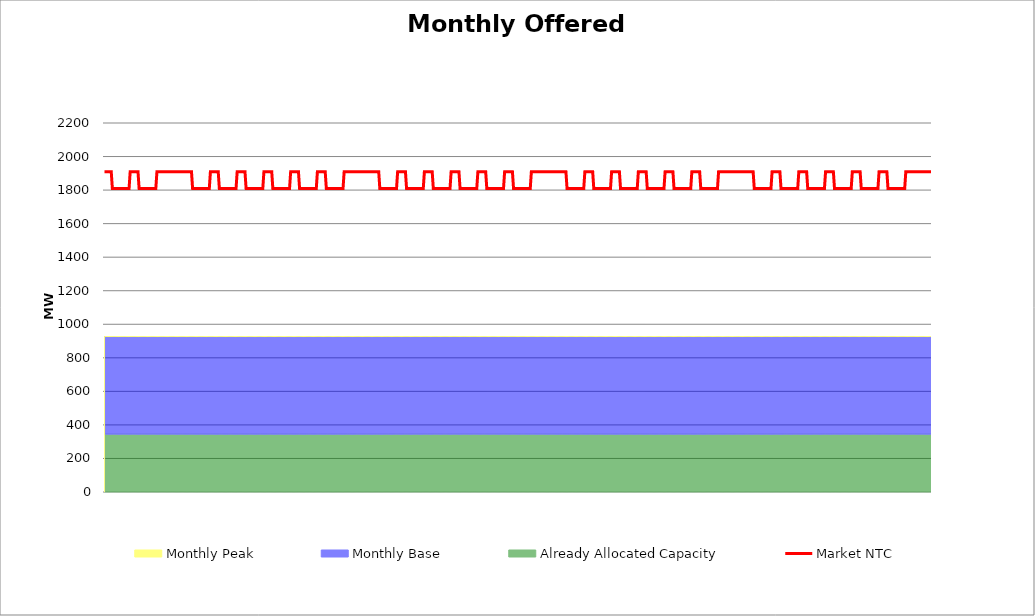
| Category | Market NTC |
|---|---|
| 0 | 1910 |
| 1 | 1910 |
| 2 | 1910 |
| 3 | 1910 |
| 4 | 1910 |
| 5 | 1910 |
| 6 | 1910 |
| 7 | 1810 |
| 8 | 1810 |
| 9 | 1810 |
| 10 | 1810 |
| 11 | 1810 |
| 12 | 1810 |
| 13 | 1810 |
| 14 | 1810 |
| 15 | 1810 |
| 16 | 1810 |
| 17 | 1810 |
| 18 | 1810 |
| 19 | 1810 |
| 20 | 1810 |
| 21 | 1810 |
| 22 | 1810 |
| 23 | 1910 |
| 24 | 1910 |
| 25 | 1910 |
| 26 | 1910 |
| 27 | 1910 |
| 28 | 1910 |
| 29 | 1910 |
| 30 | 1910 |
| 31 | 1810 |
| 32 | 1810 |
| 33 | 1810 |
| 34 | 1810 |
| 35 | 1810 |
| 36 | 1810 |
| 37 | 1810 |
| 38 | 1810 |
| 39 | 1810 |
| 40 | 1810 |
| 41 | 1810 |
| 42 | 1810 |
| 43 | 1810 |
| 44 | 1810 |
| 45 | 1810 |
| 46 | 1810 |
| 47 | 1910 |
| 48 | 1910 |
| 49 | 1910 |
| 50 | 1910 |
| 51 | 1910 |
| 52 | 1910 |
| 53 | 1910 |
| 54 | 1910 |
| 55 | 1910 |
| 56 | 1910 |
| 57 | 1910 |
| 58 | 1910 |
| 59 | 1910 |
| 60 | 1910 |
| 61 | 1910 |
| 62 | 1910 |
| 63 | 1910 |
| 64 | 1910 |
| 65 | 1910 |
| 66 | 1910 |
| 67 | 1910 |
| 68 | 1910 |
| 69 | 1910 |
| 70 | 1910 |
| 71 | 1910 |
| 72 | 1910 |
| 73 | 1910 |
| 74 | 1910 |
| 75 | 1910 |
| 76 | 1910 |
| 77 | 1910 |
| 78 | 1910 |
| 79 | 1810 |
| 80 | 1810 |
| 81 | 1810 |
| 82 | 1810 |
| 83 | 1810 |
| 84 | 1810 |
| 85 | 1810 |
| 86 | 1810 |
| 87 | 1810 |
| 88 | 1810 |
| 89 | 1810 |
| 90 | 1810 |
| 91 | 1810 |
| 92 | 1810 |
| 93 | 1810 |
| 94 | 1810 |
| 95 | 1910 |
| 96 | 1910 |
| 97 | 1910 |
| 98 | 1910 |
| 99 | 1910 |
| 100 | 1910 |
| 101 | 1910 |
| 102 | 1910 |
| 103 | 1810 |
| 104 | 1810 |
| 105 | 1810 |
| 106 | 1810 |
| 107 | 1810 |
| 108 | 1810 |
| 109 | 1810 |
| 110 | 1810 |
| 111 | 1810 |
| 112 | 1810 |
| 113 | 1810 |
| 114 | 1810 |
| 115 | 1810 |
| 116 | 1810 |
| 117 | 1810 |
| 118 | 1810 |
| 119 | 1910 |
| 120 | 1910 |
| 121 | 1910 |
| 122 | 1910 |
| 123 | 1910 |
| 124 | 1910 |
| 125 | 1910 |
| 126 | 1910 |
| 127 | 1810 |
| 128 | 1810 |
| 129 | 1810 |
| 130 | 1810 |
| 131 | 1810 |
| 132 | 1810 |
| 133 | 1810 |
| 134 | 1810 |
| 135 | 1810 |
| 136 | 1810 |
| 137 | 1810 |
| 138 | 1810 |
| 139 | 1810 |
| 140 | 1810 |
| 141 | 1810 |
| 142 | 1810 |
| 143 | 1910 |
| 144 | 1910 |
| 145 | 1910 |
| 146 | 1910 |
| 147 | 1910 |
| 148 | 1910 |
| 149 | 1910 |
| 150 | 1910 |
| 151 | 1810 |
| 152 | 1810 |
| 153 | 1810 |
| 154 | 1810 |
| 155 | 1810 |
| 156 | 1810 |
| 157 | 1810 |
| 158 | 1810 |
| 159 | 1810 |
| 160 | 1810 |
| 161 | 1810 |
| 162 | 1810 |
| 163 | 1810 |
| 164 | 1810 |
| 165 | 1810 |
| 166 | 1810 |
| 167 | 1910 |
| 168 | 1910 |
| 169 | 1910 |
| 170 | 1910 |
| 171 | 1910 |
| 172 | 1910 |
| 173 | 1910 |
| 174 | 1910 |
| 175 | 1810 |
| 176 | 1810 |
| 177 | 1810 |
| 178 | 1810 |
| 179 | 1810 |
| 180 | 1810 |
| 181 | 1810 |
| 182 | 1810 |
| 183 | 1810 |
| 184 | 1810 |
| 185 | 1810 |
| 186 | 1810 |
| 187 | 1810 |
| 188 | 1810 |
| 189 | 1810 |
| 190 | 1810 |
| 191 | 1910 |
| 192 | 1910 |
| 193 | 1910 |
| 194 | 1910 |
| 195 | 1910 |
| 196 | 1910 |
| 197 | 1910 |
| 198 | 1910 |
| 199 | 1810 |
| 200 | 1810 |
| 201 | 1810 |
| 202 | 1810 |
| 203 | 1810 |
| 204 | 1810 |
| 205 | 1810 |
| 206 | 1810 |
| 207 | 1810 |
| 208 | 1810 |
| 209 | 1810 |
| 210 | 1810 |
| 211 | 1810 |
| 212 | 1810 |
| 213 | 1810 |
| 214 | 1810 |
| 215 | 1910 |
| 216 | 1910 |
| 217 | 1910 |
| 218 | 1910 |
| 219 | 1910 |
| 220 | 1910 |
| 221 | 1910 |
| 222 | 1910 |
| 223 | 1910 |
| 224 | 1910 |
| 225 | 1910 |
| 226 | 1910 |
| 227 | 1910 |
| 228 | 1910 |
| 229 | 1910 |
| 230 | 1910 |
| 231 | 1910 |
| 232 | 1910 |
| 233 | 1910 |
| 234 | 1910 |
| 235 | 1910 |
| 236 | 1910 |
| 237 | 1910 |
| 238 | 1910 |
| 239 | 1910 |
| 240 | 1910 |
| 241 | 1910 |
| 242 | 1910 |
| 243 | 1910 |
| 244 | 1910 |
| 245 | 1910 |
| 246 | 1910 |
| 247 | 1810 |
| 248 | 1810 |
| 249 | 1810 |
| 250 | 1810 |
| 251 | 1810 |
| 252 | 1810 |
| 253 | 1810 |
| 254 | 1810 |
| 255 | 1810 |
| 256 | 1810 |
| 257 | 1810 |
| 258 | 1810 |
| 259 | 1810 |
| 260 | 1810 |
| 261 | 1810 |
| 262 | 1810 |
| 263 | 1910 |
| 264 | 1910 |
| 265 | 1910 |
| 266 | 1910 |
| 267 | 1910 |
| 268 | 1910 |
| 269 | 1910 |
| 270 | 1910 |
| 271 | 1810 |
| 272 | 1810 |
| 273 | 1810 |
| 274 | 1810 |
| 275 | 1810 |
| 276 | 1810 |
| 277 | 1810 |
| 278 | 1810 |
| 279 | 1810 |
| 280 | 1810 |
| 281 | 1810 |
| 282 | 1810 |
| 283 | 1810 |
| 284 | 1810 |
| 285 | 1810 |
| 286 | 1810 |
| 287 | 1910 |
| 288 | 1910 |
| 289 | 1910 |
| 290 | 1910 |
| 291 | 1910 |
| 292 | 1910 |
| 293 | 1910 |
| 294 | 1910 |
| 295 | 1810 |
| 296 | 1810 |
| 297 | 1810 |
| 298 | 1810 |
| 299 | 1810 |
| 300 | 1810 |
| 301 | 1810 |
| 302 | 1810 |
| 303 | 1810 |
| 304 | 1810 |
| 305 | 1810 |
| 306 | 1810 |
| 307 | 1810 |
| 308 | 1810 |
| 309 | 1810 |
| 310 | 1810 |
| 311 | 1910 |
| 312 | 1910 |
| 313 | 1910 |
| 314 | 1910 |
| 315 | 1910 |
| 316 | 1910 |
| 317 | 1910 |
| 318 | 1910 |
| 319 | 1810 |
| 320 | 1810 |
| 321 | 1810 |
| 322 | 1810 |
| 323 | 1810 |
| 324 | 1810 |
| 325 | 1810 |
| 326 | 1810 |
| 327 | 1810 |
| 328 | 1810 |
| 329 | 1810 |
| 330 | 1810 |
| 331 | 1810 |
| 332 | 1810 |
| 333 | 1810 |
| 334 | 1810 |
| 335 | 1910 |
| 336 | 1910 |
| 337 | 1910 |
| 338 | 1910 |
| 339 | 1910 |
| 340 | 1910 |
| 341 | 1910 |
| 342 | 1910 |
| 343 | 1810 |
| 344 | 1810 |
| 345 | 1810 |
| 346 | 1810 |
| 347 | 1810 |
| 348 | 1810 |
| 349 | 1810 |
| 350 | 1810 |
| 351 | 1810 |
| 352 | 1810 |
| 353 | 1810 |
| 354 | 1810 |
| 355 | 1810 |
| 356 | 1810 |
| 357 | 1810 |
| 358 | 1810 |
| 359 | 1910 |
| 360 | 1910 |
| 361 | 1910 |
| 362 | 1910 |
| 363 | 1910 |
| 364 | 1910 |
| 365 | 1910 |
| 366 | 1910 |
| 367 | 1810 |
| 368 | 1810 |
| 369 | 1810 |
| 370 | 1810 |
| 371 | 1810 |
| 372 | 1810 |
| 373 | 1810 |
| 374 | 1810 |
| 375 | 1810 |
| 376 | 1810 |
| 377 | 1810 |
| 378 | 1810 |
| 379 | 1810 |
| 380 | 1810 |
| 381 | 1810 |
| 382 | 1810 |
| 383 | 1910 |
| 384 | 1910 |
| 385 | 1910 |
| 386 | 1910 |
| 387 | 1910 |
| 388 | 1910 |
| 389 | 1910 |
| 390 | 1910 |
| 391 | 1910 |
| 392 | 1910 |
| 393 | 1910 |
| 394 | 1910 |
| 395 | 1910 |
| 396 | 1910 |
| 397 | 1910 |
| 398 | 1910 |
| 399 | 1910 |
| 400 | 1910 |
| 401 | 1910 |
| 402 | 1910 |
| 403 | 1910 |
| 404 | 1910 |
| 405 | 1910 |
| 406 | 1910 |
| 407 | 1910 |
| 408 | 1910 |
| 409 | 1910 |
| 410 | 1910 |
| 411 | 1910 |
| 412 | 1910 |
| 413 | 1910 |
| 414 | 1910 |
| 415 | 1810 |
| 416 | 1810 |
| 417 | 1810 |
| 418 | 1810 |
| 419 | 1810 |
| 420 | 1810 |
| 421 | 1810 |
| 422 | 1810 |
| 423 | 1810 |
| 424 | 1810 |
| 425 | 1810 |
| 426 | 1810 |
| 427 | 1810 |
| 428 | 1810 |
| 429 | 1810 |
| 430 | 1810 |
| 431 | 1910 |
| 432 | 1910 |
| 433 | 1910 |
| 434 | 1910 |
| 435 | 1910 |
| 436 | 1910 |
| 437 | 1910 |
| 438 | 1910 |
| 439 | 1810 |
| 440 | 1810 |
| 441 | 1810 |
| 442 | 1810 |
| 443 | 1810 |
| 444 | 1810 |
| 445 | 1810 |
| 446 | 1810 |
| 447 | 1810 |
| 448 | 1810 |
| 449 | 1810 |
| 450 | 1810 |
| 451 | 1810 |
| 452 | 1810 |
| 453 | 1810 |
| 454 | 1810 |
| 455 | 1910 |
| 456 | 1910 |
| 457 | 1910 |
| 458 | 1910 |
| 459 | 1910 |
| 460 | 1910 |
| 461 | 1910 |
| 462 | 1910 |
| 463 | 1810 |
| 464 | 1810 |
| 465 | 1810 |
| 466 | 1810 |
| 467 | 1810 |
| 468 | 1810 |
| 469 | 1810 |
| 470 | 1810 |
| 471 | 1810 |
| 472 | 1810 |
| 473 | 1810 |
| 474 | 1810 |
| 475 | 1810 |
| 476 | 1810 |
| 477 | 1810 |
| 478 | 1810 |
| 479 | 1910 |
| 480 | 1910 |
| 481 | 1910 |
| 482 | 1910 |
| 483 | 1910 |
| 484 | 1910 |
| 485 | 1910 |
| 486 | 1910 |
| 487 | 1810 |
| 488 | 1810 |
| 489 | 1810 |
| 490 | 1810 |
| 491 | 1810 |
| 492 | 1810 |
| 493 | 1810 |
| 494 | 1810 |
| 495 | 1810 |
| 496 | 1810 |
| 497 | 1810 |
| 498 | 1810 |
| 499 | 1810 |
| 500 | 1810 |
| 501 | 1810 |
| 502 | 1810 |
| 503 | 1910 |
| 504 | 1910 |
| 505 | 1910 |
| 506 | 1910 |
| 507 | 1910 |
| 508 | 1910 |
| 509 | 1910 |
| 510 | 1910 |
| 511 | 1810 |
| 512 | 1810 |
| 513 | 1810 |
| 514 | 1810 |
| 515 | 1810 |
| 516 | 1810 |
| 517 | 1810 |
| 518 | 1810 |
| 519 | 1810 |
| 520 | 1810 |
| 521 | 1810 |
| 522 | 1810 |
| 523 | 1810 |
| 524 | 1810 |
| 525 | 1810 |
| 526 | 1810 |
| 527 | 1910 |
| 528 | 1910 |
| 529 | 1910 |
| 530 | 1910 |
| 531 | 1910 |
| 532 | 1910 |
| 533 | 1910 |
| 534 | 1910 |
| 535 | 1810 |
| 536 | 1810 |
| 537 | 1810 |
| 538 | 1810 |
| 539 | 1810 |
| 540 | 1810 |
| 541 | 1810 |
| 542 | 1810 |
| 543 | 1810 |
| 544 | 1810 |
| 545 | 1810 |
| 546 | 1810 |
| 547 | 1810 |
| 548 | 1810 |
| 549 | 1810 |
| 550 | 1810 |
| 551 | 1910 |
| 552 | 1910 |
| 553 | 1910 |
| 554 | 1910 |
| 555 | 1910 |
| 556 | 1910 |
| 557 | 1910 |
| 558 | 1910 |
| 559 | 1910 |
| 560 | 1910 |
| 561 | 1910 |
| 562 | 1910 |
| 563 | 1910 |
| 564 | 1910 |
| 565 | 1910 |
| 566 | 1910 |
| 567 | 1910 |
| 568 | 1910 |
| 569 | 1910 |
| 570 | 1910 |
| 571 | 1910 |
| 572 | 1910 |
| 573 | 1910 |
| 574 | 1910 |
| 575 | 1910 |
| 576 | 1910 |
| 577 | 1910 |
| 578 | 1910 |
| 579 | 1910 |
| 580 | 1910 |
| 581 | 1910 |
| 582 | 1910 |
| 583 | 1810 |
| 584 | 1810 |
| 585 | 1810 |
| 586 | 1810 |
| 587 | 1810 |
| 588 | 1810 |
| 589 | 1810 |
| 590 | 1810 |
| 591 | 1810 |
| 592 | 1810 |
| 593 | 1810 |
| 594 | 1810 |
| 595 | 1810 |
| 596 | 1810 |
| 597 | 1810 |
| 598 | 1810 |
| 599 | 1910 |
| 600 | 1910 |
| 601 | 1910 |
| 602 | 1910 |
| 603 | 1910 |
| 604 | 1910 |
| 605 | 1910 |
| 606 | 1910 |
| 607 | 1810 |
| 608 | 1810 |
| 609 | 1810 |
| 610 | 1810 |
| 611 | 1810 |
| 612 | 1810 |
| 613 | 1810 |
| 614 | 1810 |
| 615 | 1810 |
| 616 | 1810 |
| 617 | 1810 |
| 618 | 1810 |
| 619 | 1810 |
| 620 | 1810 |
| 621 | 1810 |
| 622 | 1810 |
| 623 | 1910 |
| 624 | 1910 |
| 625 | 1910 |
| 626 | 1910 |
| 627 | 1910 |
| 628 | 1910 |
| 629 | 1910 |
| 630 | 1910 |
| 631 | 1810 |
| 632 | 1810 |
| 633 | 1810 |
| 634 | 1810 |
| 635 | 1810 |
| 636 | 1810 |
| 637 | 1810 |
| 638 | 1810 |
| 639 | 1810 |
| 640 | 1810 |
| 641 | 1810 |
| 642 | 1810 |
| 643 | 1810 |
| 644 | 1810 |
| 645 | 1810 |
| 646 | 1810 |
| 647 | 1910 |
| 648 | 1910 |
| 649 | 1910 |
| 650 | 1910 |
| 651 | 1910 |
| 652 | 1910 |
| 653 | 1910 |
| 654 | 1910 |
| 655 | 1810 |
| 656 | 1810 |
| 657 | 1810 |
| 658 | 1810 |
| 659 | 1810 |
| 660 | 1810 |
| 661 | 1810 |
| 662 | 1810 |
| 663 | 1810 |
| 664 | 1810 |
| 665 | 1810 |
| 666 | 1810 |
| 667 | 1810 |
| 668 | 1810 |
| 669 | 1810 |
| 670 | 1810 |
| 671 | 1910 |
| 672 | 1910 |
| 673 | 1910 |
| 674 | 1910 |
| 675 | 1910 |
| 676 | 1910 |
| 677 | 1910 |
| 678 | 1910 |
| 679 | 1810 |
| 680 | 1810 |
| 681 | 1810 |
| 682 | 1810 |
| 683 | 1810 |
| 684 | 1810 |
| 685 | 1810 |
| 686 | 1810 |
| 687 | 1810 |
| 688 | 1810 |
| 689 | 1810 |
| 690 | 1810 |
| 691 | 1810 |
| 692 | 1810 |
| 693 | 1810 |
| 694 | 1810 |
| 695 | 1910 |
| 696 | 1910 |
| 697 | 1910 |
| 698 | 1910 |
| 699 | 1910 |
| 700 | 1910 |
| 701 | 1910 |
| 702 | 1910 |
| 703 | 1810 |
| 704 | 1810 |
| 705 | 1810 |
| 706 | 1810 |
| 707 | 1810 |
| 708 | 1810 |
| 709 | 1810 |
| 710 | 1810 |
| 711 | 1810 |
| 712 | 1810 |
| 713 | 1810 |
| 714 | 1810 |
| 715 | 1810 |
| 716 | 1810 |
| 717 | 1810 |
| 718 | 1810 |
| 719 | 1910 |
| 720 | 1910 |
| 721 | 1910 |
| 722 | 1910 |
| 723 | 1910 |
| 724 | 1910 |
| 725 | 1910 |
| 726 | 1910 |
| 727 | 1910 |
| 728 | 1910 |
| 729 | 1910 |
| 730 | 1910 |
| 731 | 1910 |
| 732 | 1910 |
| 733 | 1910 |
| 734 | 1910 |
| 735 | 1910 |
| 736 | 1910 |
| 737 | 1910 |
| 738 | 1910 |
| 739 | 1910 |
| 740 | 1910 |
| 741 | 1910 |
| 742 | 1910 |